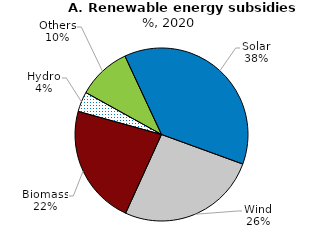
| Category | 2020 |
|---|---|
| Solar | 30 |
| Wind | 21 |
| Biomass | 18 |
| Hydro | 3 |
| Others | 8 |